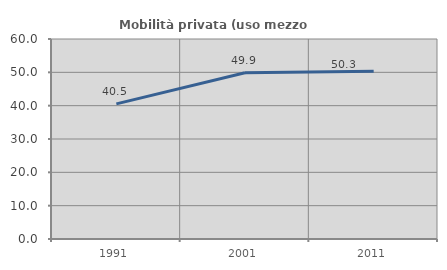
| Category | Mobilità privata (uso mezzo privato) |
|---|---|
| 1991.0 | 40.531 |
| 2001.0 | 49.874 |
| 2011.0 | 50.325 |